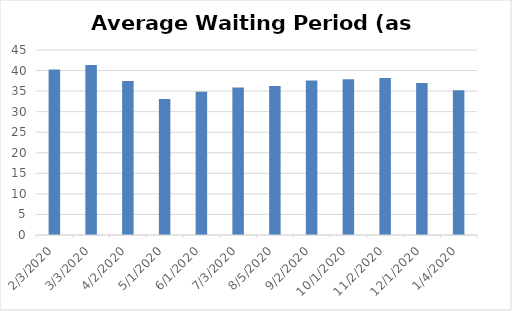
| Category | Current |
|---|---|
| 2/3/20 | 40.23 |
| 3/3/20 | 41.37 |
| 4/2/20 | 37.44 |
| 5/1/20 | 33.1 |
| 6/1/20 | 34.83 |
| 7/3/20 | 35.9 |
| 8/5/20 | 36.24 |
| 9/2/20 | 37.61 |
| 10/1/20 | 37.88 |
| 11/2/20 | 38.21 |
| 12/1/20 | 36.95 |
| 1/4/20 | 35.19 |